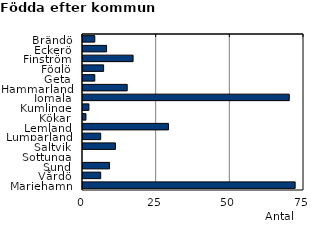
| Category | Series 0 |
|---|---|
| Brändö | 4 |
| Eckerö | 8 |
| Finström | 17 |
| Föglö | 7 |
| Geta | 4 |
| Hammarland | 15 |
| Jomala | 70 |
| Kumlinge | 2 |
| Kökar | 1 |
| Lemland | 29 |
| Lumparland | 6 |
| Saltvik | 11 |
| Sottunga | 0 |
| Sund | 9 |
| Vårdö | 6 |
| Mariehamn | 72 |